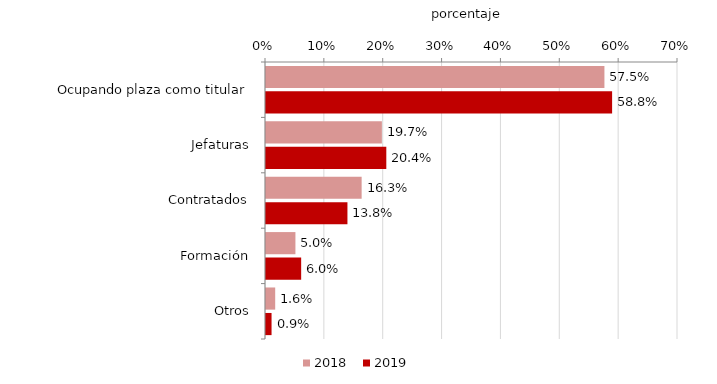
| Category | 2018 | 2019 |
|---|---|---|
| Ocupando plaza como titular | 0.575 | 0.588 |
| Jefaturas | 0.197 | 0.204 |
| Contratados | 0.162 | 0.138 |
| Formación | 0.05 | 0.06 |
| Otros | 0.016 | 0.009 |